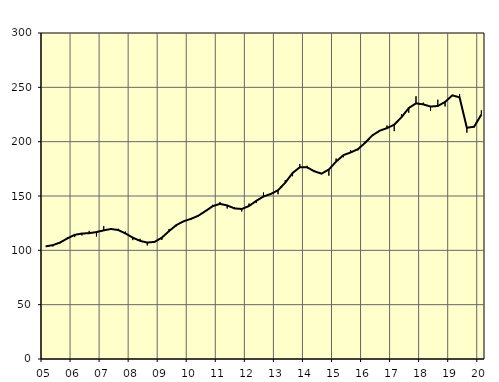
| Category | Trend | Säsongrensat |
|---|---|---|
| 5.0 | 103.62 | 103.7 |
| nan | 104.8 | 103.6 |
| 6.0 | 107.2 | 106.6 |
| 6.0 | 111.01 | 111.9 |
| 6.0 | 114.23 | 112.2 |
| nan | 115.44 | 113.7 |
| 7.0 | 115.82 | 117.9 |
| 7.0 | 116.78 | 112.8 |
| 7.0 | 118.4 | 122.3 |
| nan | 119.66 | 120 |
| 8.0 | 118.66 | 119.9 |
| 8.0 | 115.53 | 117.3 |
| 8.0 | 111.69 | 109.4 |
| nan | 108.7 | 110.6 |
| 9.0 | 107.14 | 104.5 |
| 9.0 | 107.79 | 107.4 |
| 9.0 | 111.66 | 109.6 |
| nan | 117.73 | 119.7 |
| 10.0 | 123.25 | 122.1 |
| 10.0 | 126.71 | 126.1 |
| 10.0 | 128.95 | 128.1 |
| nan | 131.76 | 131.9 |
| 11.0 | 136.05 | 136.9 |
| 11.0 | 140.62 | 141.9 |
| 11.0 | 142.78 | 144.5 |
| nan | 141.33 | 138.5 |
| 12.0 | 138.59 | 139.9 |
| 12.0 | 138.06 | 135.8 |
| 12.0 | 140.74 | 143.1 |
| nan | 145.53 | 143.5 |
| 13.0 | 149.53 | 153.2 |
| 13.0 | 151.84 | 152 |
| 13.0 | 155.29 | 151.6 |
| nan | 162.27 | 164.7 |
| 14.0 | 171.16 | 168.2 |
| 14.0 | 176.47 | 179.4 |
| 14.0 | 176.39 | 177.8 |
| nan | 172.72 | 173.6 |
| 15.0 | 170.59 | 170 |
| 15.0 | 174.38 | 168.7 |
| 15.0 | 181.67 | 184.5 |
| nan | 187.6 | 185.6 |
| 16.0 | 190.07 | 192.3 |
| 16.0 | 193.08 | 192 |
| 16.0 | 198.99 | 200.3 |
| nan | 205.83 | 205.5 |
| 17.0 | 210.09 | 210.3 |
| 17.0 | 212.45 | 214.9 |
| 17.0 | 215.65 | 209.7 |
| nan | 222.4 | 225.2 |
| 18.0 | 230.98 | 226.6 |
| 18.0 | 235.24 | 241.8 |
| 18.0 | 234.32 | 235.9 |
| nan | 232.31 | 228.2 |
| 19.0 | 232.84 | 238.6 |
| 19.0 | 236.5 | 232.4 |
| 19.0 | 242.63 | 241.9 |
| nan | 240.76 | 243.9 |
| 20.0 | 212.78 | 208.3 |
| 20.0 | 213.77 | 213.2 |
| 20.0 | 224.96 | 228.8 |